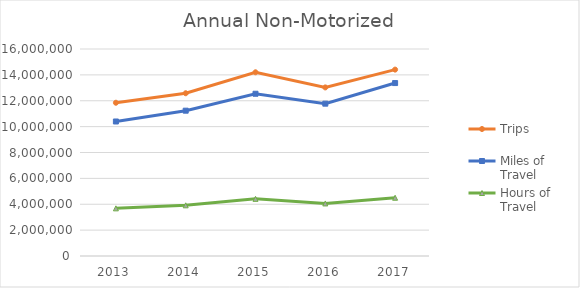
| Category | Trips | Miles of Travel | Hours of Travel |
|---|---|---|---|
| 2013 | 11846284.381 | 10396242.233 | 3682836.636 |
| 2014 | 12580251.18 | 11232039.865 | 3917318.448 |
| 2015 | 14199668.072 | 12540687.95 | 4417070.972 |
| 2016 | 13030350.949 | 11775020.905 | 4062113.396 |
| 2017 | 14406944.783 | 13367091.89 | 4502701.703 |